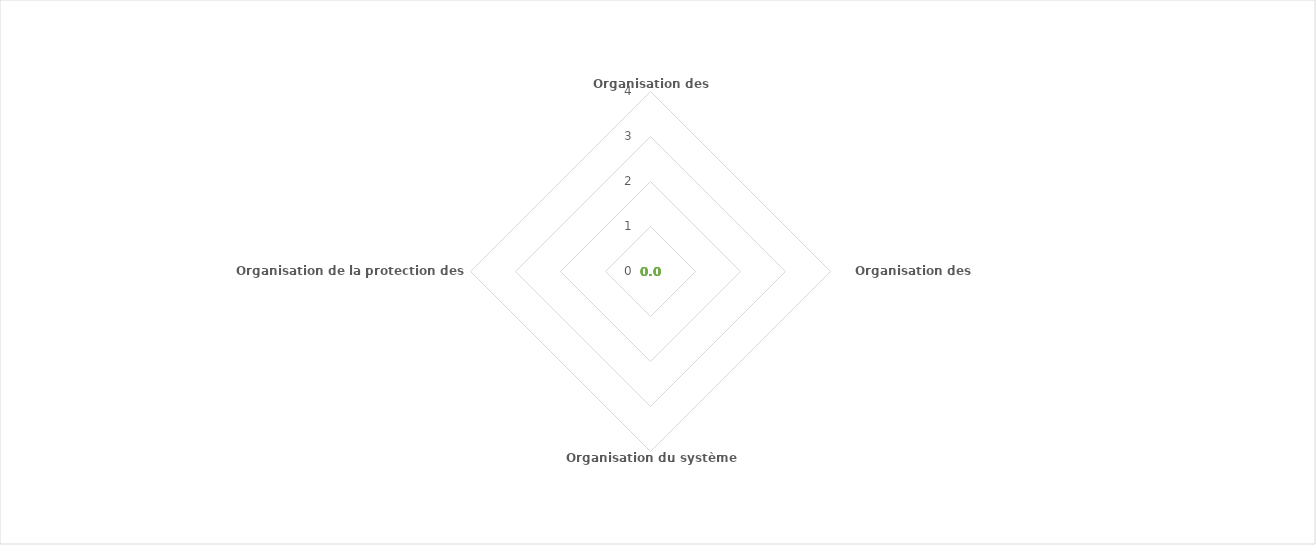
| Category | Series 0 |
|---|---|
| Organisation des acteurs | 0 |
| Organisation des contrôles | 0 |
| Organisation du système d'information | 0 |
| Organisation de la protection des actifs | 0 |